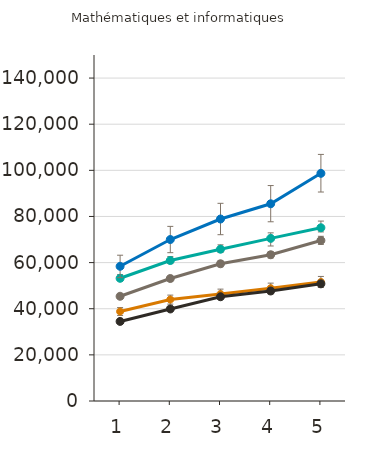
| Category | Certificat d'études collégial | Diplôme d'études collégial | Baccalauréat | Maîtrise | Doctorat | Grade professionnel |
|---|---|---|---|---|---|---|
| 1.0 | 38800 | 34500 | 45400 | 53200 | 58400 |  |
| 2.0 | 44000 | 39900 | 53100 | 60900 | 70000 |  |
| 3.0 | 46400 | 45200 | 59500 | 65800 | 78900 |  |
| 4.0 | 48900 | 47700 | 63400 | 70500 | 85500 |  |
| 5.0 | 51600 | 50800 | 69600 | 75100 | 98700 |  |